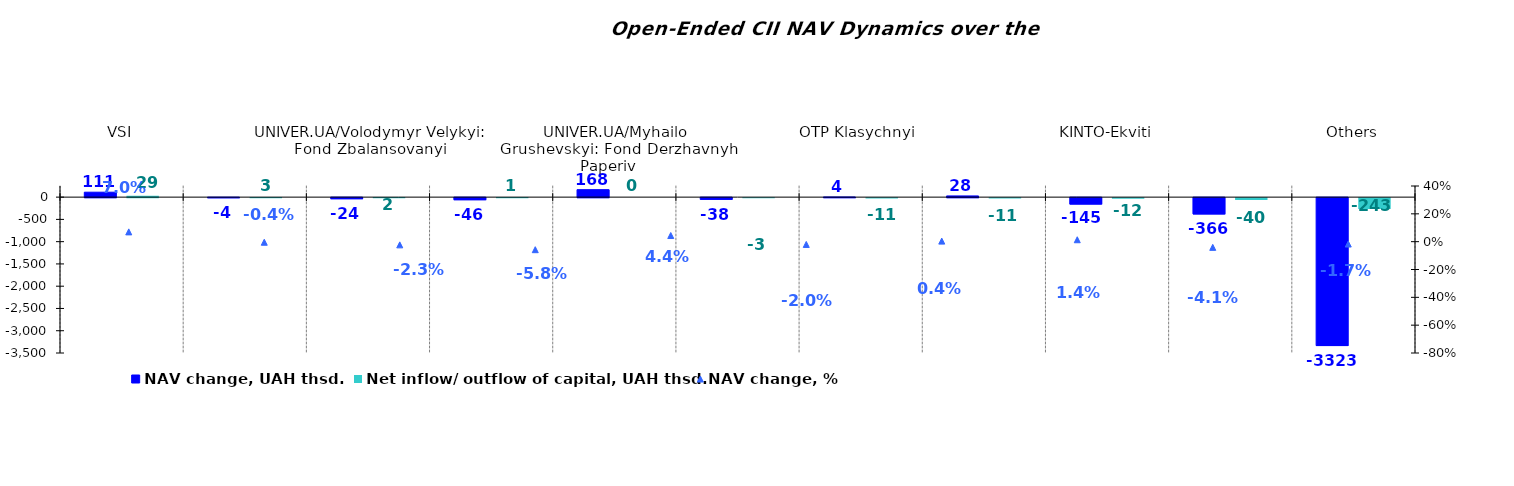
| Category | NAV change, UAH thsd. | Net inflow/ outflow of capital, UAH thsd. |
|---|---|---|
| VSI | 110.872 | 29.075 |
| TASK Resurs | -3.903 | 2.935 |
| UNIVER.UA/Volodymyr Velykyi: Fond Zbalansovanyi | -23.915 | 1.719 |
| UNIVER.UA/Iaroslav Mudryi: Fond Aktsii | -46.477 | 1.189 |
| UNIVER.UA/Myhailo Grushevskyi: Fond Derzhavnyh Paperiv    | 167.803 | 0 |
| OTP Fond Aktsii | -38.423 | -3.225 |
| OTP Klasychnyi  | 4.236 | -10.57 |
| KINTO-Kaznacheyskyi | 27.537 | -10.873 |
| KINTO-Ekviti | -145.323 | -11.748 |
| KINTO-Klasychnyi | -365.538 | -40.198 |
| Others | -3322.779 | -242.901 |